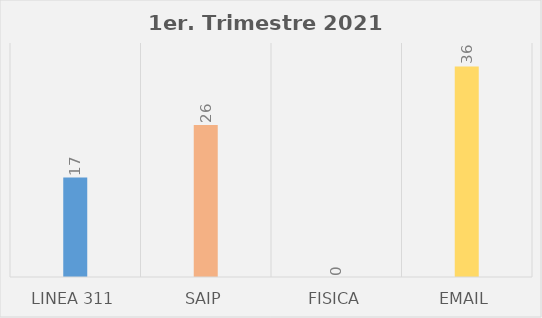
| Category | Series 0 |
|---|---|
| Linea 311 | 17 |
| SAIP | 26 |
| Fisica | 0 |
| Email | 36 |